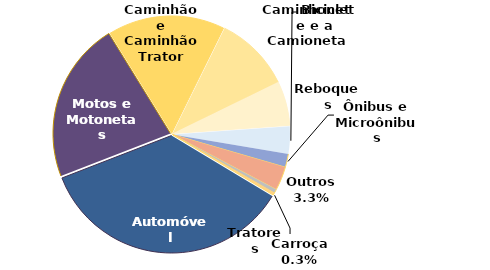
| Category | Qtde |
|---|---|
| Automóvel | 792 |
| Motos e Motonetas | 493 |
| Caminhão e Caminhão Trator | 359 |
| Caminhonete e Camioneta | 234 |
| Reboques | 136 |
| Bicicleta | 84 |
| Ônibus e Microônibus | 41 |
| Outros | 73 |
| Tratores | 12 |
| Carroça | 7 |